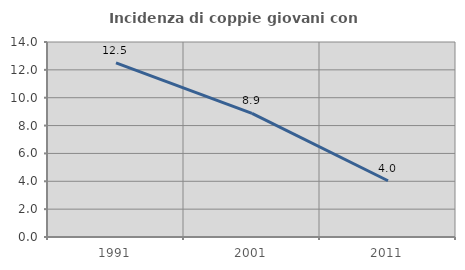
| Category | Incidenza di coppie giovani con figli |
|---|---|
| 1991.0 | 12.5 |
| 2001.0 | 8.88 |
| 2011.0 | 4.037 |